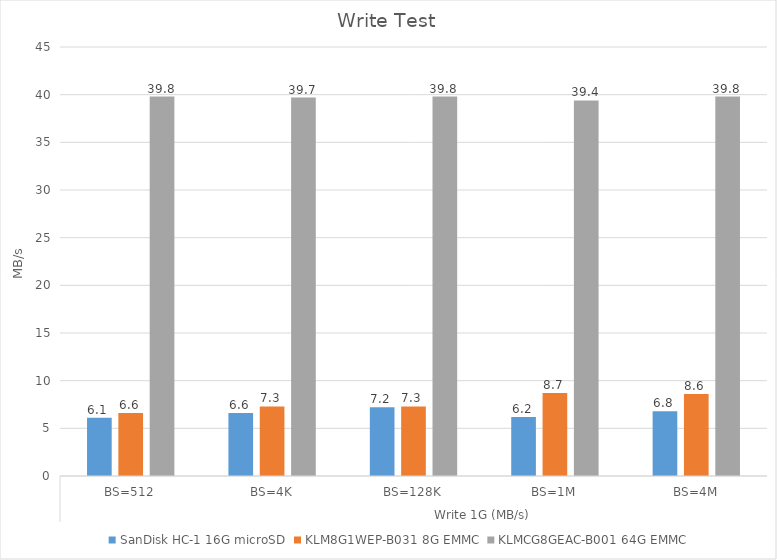
| Category | SanDisk HC-1 16G microSD | KLM8G1WEP-B031 8G EMMC | KLMCG8GEAC-B001 64G EMMC |
|---|---|---|---|
| 0 | 6.1 | 6.6 | 39.8 |
| 1 | 6.6 | 7.3 | 39.7 |
| 2 | 7.2 | 7.3 | 39.8 |
| 3 | 6.2 | 8.7 | 39.4 |
| 4 | 6.8 | 8.6 | 39.8 |